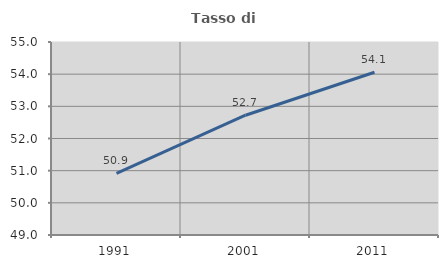
| Category | Tasso di occupazione   |
|---|---|
| 1991.0 | 50.919 |
| 2001.0 | 52.723 |
| 2011.0 | 54.059 |